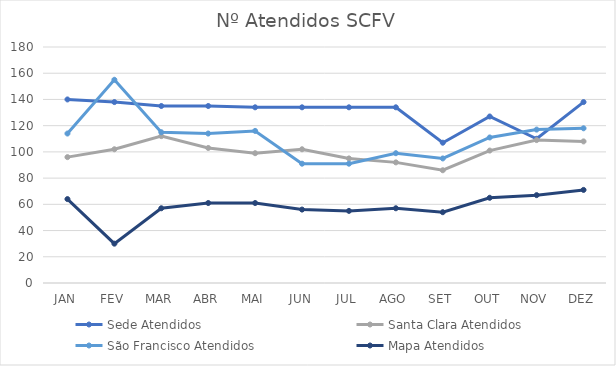
| Category | Sede | Santa Clara | São Francisco | Mapa |
|---|---|---|---|---|
| JAN | 140 | 96 | 114 | 64 |
| FEV | 138 | 102 | 155 | 30 |
| MAR | 135 | 112 | 115 | 57 |
| ABR | 135 | 103 | 114 | 61 |
| MAI | 134 | 99 | 116 | 61 |
| JUN | 134 | 102 | 91 | 56 |
| JUL | 134 | 95 | 91 | 55 |
| AGO | 134 | 92 | 99 | 57 |
| SET | 107 | 86 | 95 | 54 |
| OUT | 127 | 101 | 111 | 65 |
| NOV | 110 | 109 | 117 | 67 |
| DEZ | 138 | 108 | 118 | 71 |